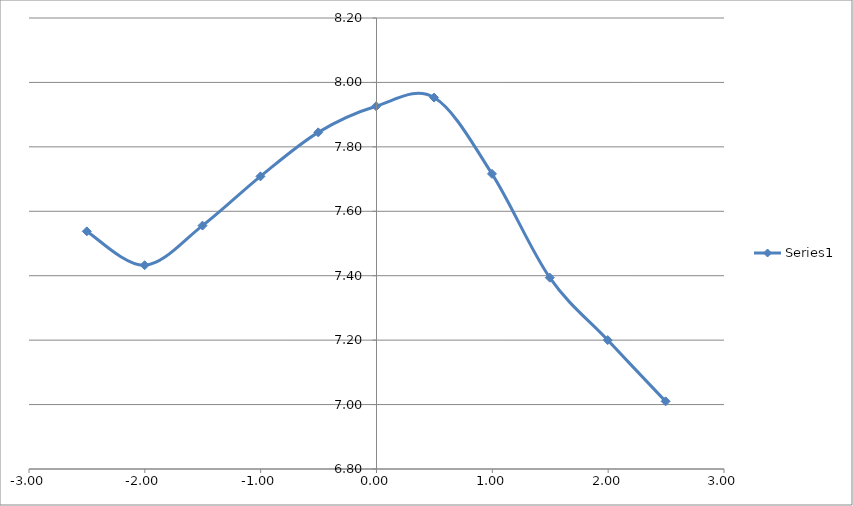
| Category | Series 0 |
|---|---|
| -2.5010000000000003 | 7.538 |
| -2.002 | 7.433 |
| -1.5019999999999998 | 7.556 |
| -1.0019999999999998 | 7.708 |
| -0.5030000000000001 | 7.845 |
| -0.0030000000000001137 | 7.926 |
| 0.4969999999999999 | 7.953 |
| 0.9969999999999999 | 7.716 |
| 1.4959999999999996 | 7.394 |
| 1.9959999999999996 | 7.2 |
| 2.4959999999999996 | 7.01 |